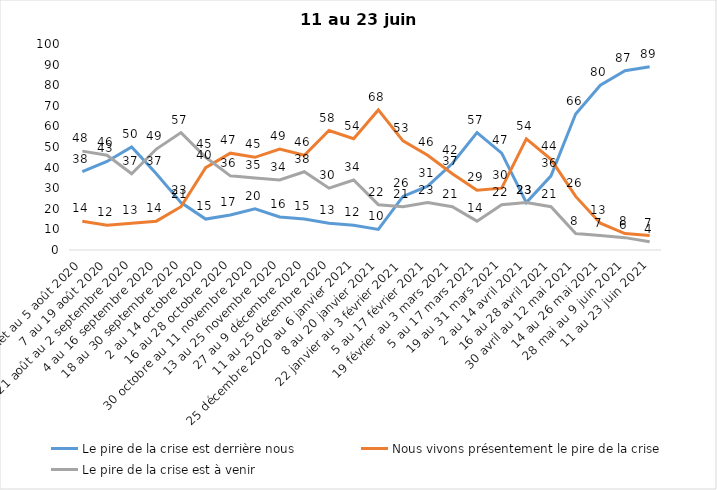
| Category | Le pire de la crise est derrière nous | Nous vivons présentement le pire de la crise | Le pire de la crise est à venir |
|---|---|---|---|
| 24 juillet au 5 août 2020 | 38 | 14 | 48 |
| 7 au 19 août 2020 | 43 | 12 | 46 |
| 21 août au 2 septembre 2020 | 50 | 13 | 37 |
| 4 au 16 septembre 2020 | 37 | 14 | 49 |
| 18 au 30 septembre 2020 | 23 | 21 | 57 |
| 2 au 14 octobre 2020 | 15 | 40 | 45 |
| 16 au 28 octobre 2020 | 17 | 47 | 36 |
| 30 octobre au 11 novembre 2020 | 20 | 45 | 35 |
| 13 au 25 novembre 2020 | 16 | 49 | 34 |
| 27 au 9 décembre 2020 | 15 | 46 | 38 |
| 11 au 25 décembre 2020 | 13 | 58 | 30 |
| 25 décembre 2020 au 6 janvier 2021 | 12 | 54 | 34 |
| 8 au 20 janvier 2021 | 10 | 68 | 22 |
| 22 janvier au 3 février 2021 | 26 | 53 | 21 |
| 5 au 17 février 2021 | 31 | 46 | 23 |
| 19 février au 3 mars 2021 | 42 | 37 | 21 |
| 5 au 17 mars 2021 | 57 | 29 | 14 |
| 19 au 31 mars 2021 | 47 | 30 | 22 |
| 2 au 14 avril 2021 | 23 | 54 | 23 |
| 16 au 28 avril 2021 | 36 | 44 | 21 |
| 30 avril au 12 mai 2021 | 66 | 26 | 8 |
| 14 au 26 mai 2021 | 80 | 13 | 7 |
| 28 mai au 9 juin 2021 | 87 | 8 | 6 |
| 11 au 23 juin 2021 | 89 | 7 | 4 |